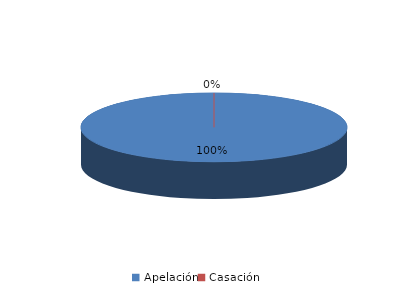
| Category | Series 0 |
|---|---|
| Apelación | 10 |
| Casación | 0 |